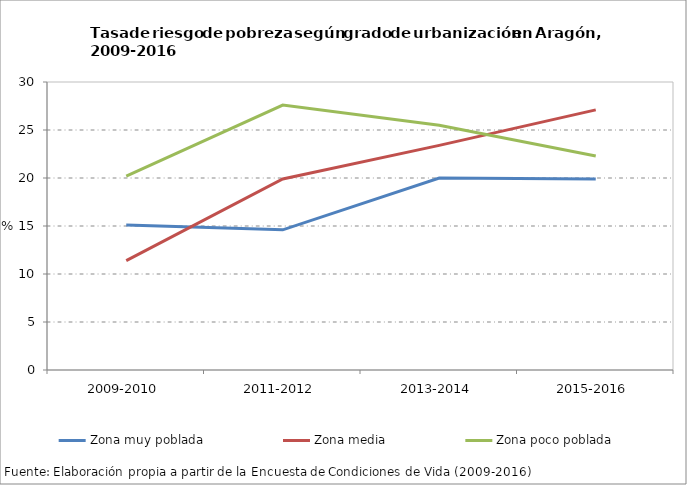
| Category | Zona muy poblada | Zona media | Zona poco poblada |
|---|---|---|---|
| 2009-2010 | 15.1 | 11.4 | 20.2 |
| 2011-2012 | 14.6 | 19.9 | 27.6 |
| 2013-2014 | 20 | 23.4 | 25.5 |
| 2015-2016 | 19.9 | 27.1 | 22.3 |